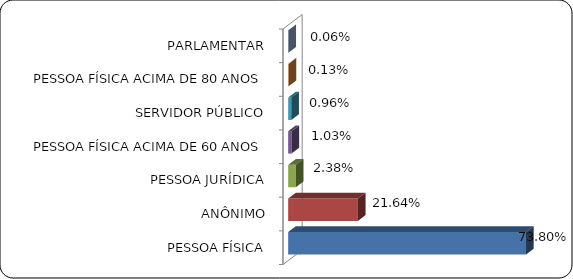
| Category | Series 0 |
|---|---|
|      PESSOA FÍSICA | 0.738 |
|      ANÔNIMO | 0.216 |
|      PESSOA JURÍDICA | 0.024 |
|      PESSOA FÍSICA ACIMA DE 60 ANOS | 0.01 |
|      SERVIDOR PÚBLICO | 0.01 |
|      PESSOA FÍSICA ACIMA DE 80 ANOS | 0.001 |
|      PARLAMENTAR | 0.001 |